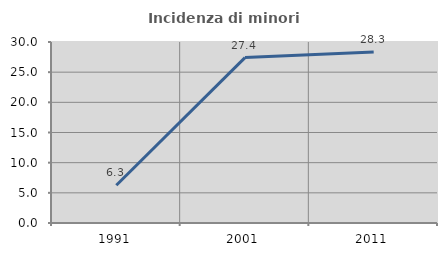
| Category | Incidenza di minori stranieri |
|---|---|
| 1991.0 | 6.25 |
| 2001.0 | 27.419 |
| 2011.0 | 28.346 |